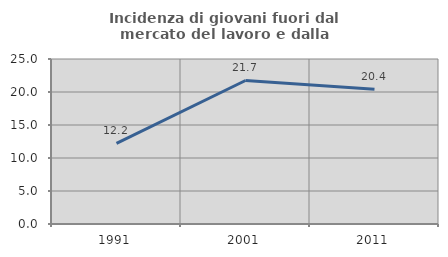
| Category | Incidenza di giovani fuori dal mercato del lavoro e dalla formazione  |
|---|---|
| 1991.0 | 12.212 |
| 2001.0 | 21.745 |
| 2011.0 | 20.401 |